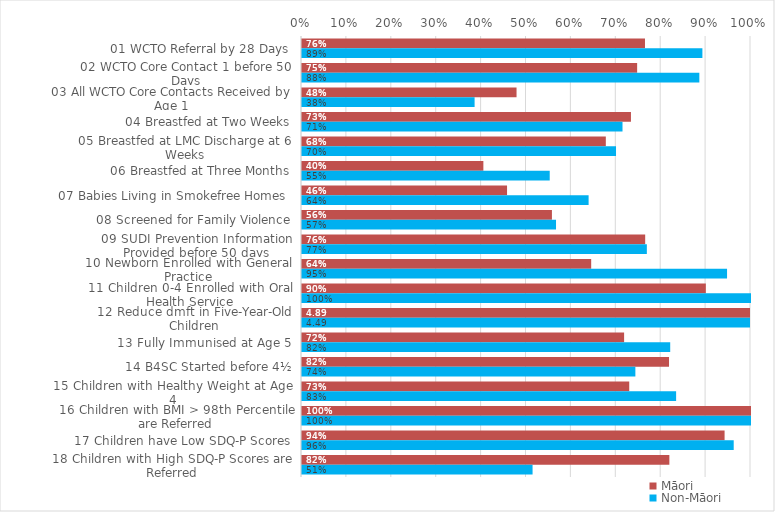
| Category | Māori | Non-Māori |
|---|---|---|
| 01 WCTO Referral by 28 Days | 0.764 | 0.892 |
| 02 WCTO Core Contact 1 before 50 Days | 0.746 | 0.885 |
| 03 All WCTO Core Contacts Received by Age 1 | 0.478 | 0.384 |
| 04 Breastfed at Two Weeks | 0.733 | 0.714 |
| 05 Breastfed at LMC Discharge at 6 Weeks | 0.677 | 0.699 |
| 06 Breastfed at Three Months | 0.404 | 0.552 |
| 07 Babies Living in Smokefree Homes  | 0.457 | 0.638 |
| 08 Screened for Family Violence | 0.557 | 0.566 |
| 09 SUDI Prevention Information Provided before 50 days | 0.764 | 0.768 |
| 10 Newborn Enrolled with General Practice | 0.644 | 0.947 |
| 11 Children 0-4 Enrolled with Oral Health Service | 0.899 | 1 |
| 12 Reduce dmft in Five-Year-Old Children | 4.894 | 4.487 |
| 13 Fully Immunised at Age 5 | 0.717 | 0.82 |
| 14 B4SC Started before 4½ | 0.817 | 0.742 |
| 15 Children with Healthy Weight at Age 4 | 0.729 | 0.833 |
| 16 Children with BMI > 98th Percentile are Referred | 1 | 1 |
| 17 Children have Low SDQ-P Scores | 0.941 | 0.961 |
| 18 Children with High SDQ-P Scores are Referred | 0.818 | 0.514 |